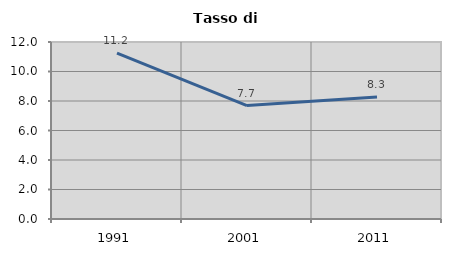
| Category | Tasso di disoccupazione   |
|---|---|
| 1991.0 | 11.243 |
| 2001.0 | 7.689 |
| 2011.0 | 8.271 |